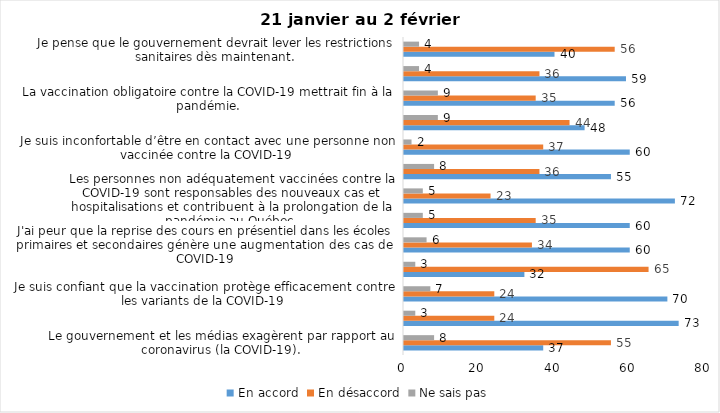
| Category | En accord | En désaccord | Ne sais pas |
|---|---|---|---|
| Le gouvernement et les médias exagèrent par rapport au coronavirus (la COVID-19). | 37 | 55 | 8 |
| J’ai peur que le système de santé soit débordé par les cas de COVID-19. | 73 | 24 | 3 |
| Je suis confiant que la vaccination protège efficacement contre les variants de la COVID-19 | 70 | 24 | 7 |
| Je suis favorable à ce que le port du masque ne soit plus obligatoire au Québec. | 32 | 65 | 3 |
| J'ai peur que la reprise des cours en présentiel dans les écoles primaires et secondaires génère une augmentation des cas de COVID-19 | 60 | 34 | 6 |
| Je crois que le passeport vaccinal devrait être requis pour davantage de services et commerces (ex. : spas, centre d’achats, centre de soins personnels. | 60 | 35 | 5 |
| Les personnes non adéquatement vaccinées contre la COVID-19 sont responsables des nouveaux cas et hospitalisations et contribuent à la prolongation de la pandémie au Québec. | 72 | 23 | 5 |
| La pandémie ne sera pas terminée au Québec avant que tous les habitants de la terre puissent être vaccinés contre la COVID-19.   | 55 | 36 | 8 |
| Je suis inconfortable d’être en contact avec une personne non vaccinée contre la COVID-19 | 60 | 37 | 2 |
| Je n'ai pas peur du variant Omicron, car il semble moins dangereux pour la santé. | 48 | 44 | 9 |
| La vaccination obligatoire contre la COVID-19 mettrait fin à la pandémie. | 56 | 35 | 9 |
| Je suis favorable à ce que les personnes non vaccinées paient une taxe supplémentaire (contribution santé). | 59 | 36 | 4 |
| Je pense que le gouvernement devrait lever les restrictions sanitaires dès maintenant. | 40 | 56 | 4 |